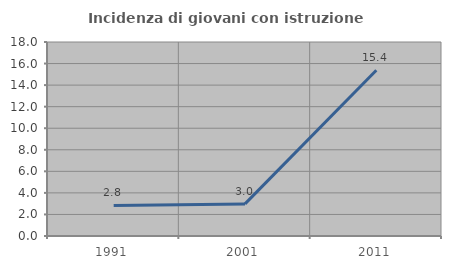
| Category | Incidenza di giovani con istruzione universitaria |
|---|---|
| 1991.0 | 2.837 |
| 2001.0 | 2.979 |
| 2011.0 | 15.385 |